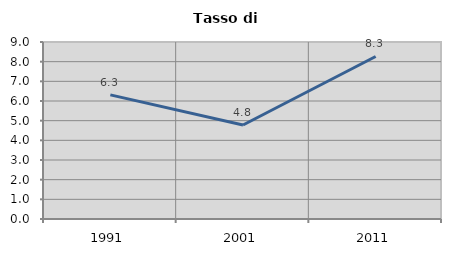
| Category | Tasso di disoccupazione   |
|---|---|
| 1991.0 | 6.312 |
| 2001.0 | 4.778 |
| 2011.0 | 8.263 |